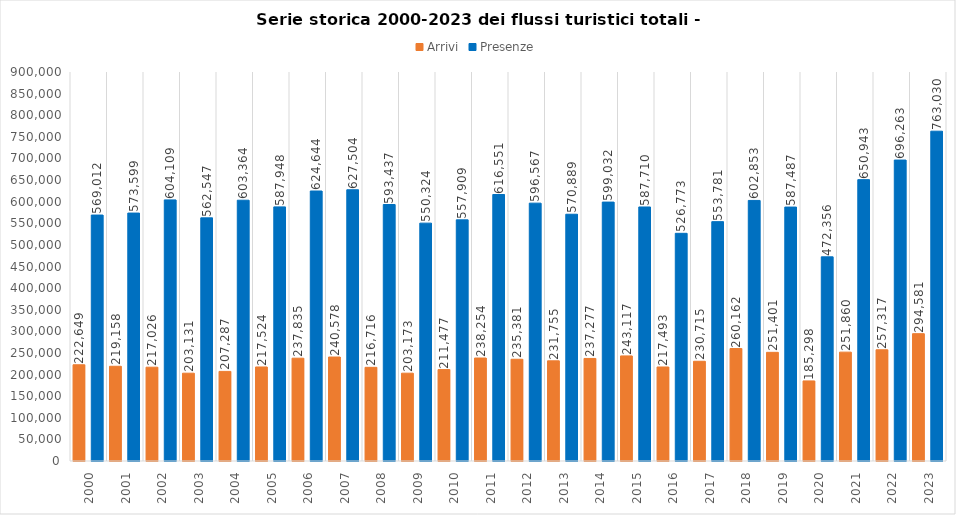
| Category | Arrivi | Presenze |
|---|---|---|
| 2000.0 | 222649 | 569012 |
| 2001.0 | 219158 | 573599 |
| 2002.0 | 217026 | 604109 |
| 2003.0 | 203131 | 562547 |
| 2004.0 | 207287 | 603364 |
| 2005.0 | 217524 | 587948 |
| 2006.0 | 237835 | 624644 |
| 2007.0 | 240578 | 627504 |
| 2008.0 | 216716 | 593437 |
| 2009.0 | 203173 | 550324 |
| 2010.0 | 211477 | 557909 |
| 2011.0 | 238254 | 616551 |
| 2012.0 | 235381 | 596567 |
| 2013.0 | 231755 | 570889 |
| 2014.0 | 237277 | 599032 |
| 2015.0 | 243117 | 587710 |
| 2016.0 | 217493 | 526773 |
| 2017.0 | 230715 | 553781 |
| 2018.0 | 260162 | 602853 |
| 2019.0 | 251401 | 587487 |
| 2020.0 | 185298 | 472356 |
| 2021.0 | 251860 | 650943 |
| 2022.0 | 257317 | 696263 |
| 2023.0 | 294581 | 763030 |